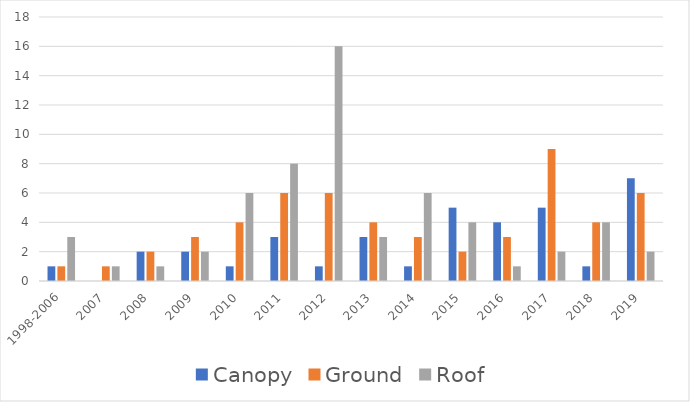
| Category | Canopy | Ground | Roof |
|---|---|---|---|
| 1998-2006 | 1 | 1 | 3 |
| 2007 | 0 | 1 | 1 |
| 2008 | 2 | 2 | 1 |
| 2009 | 2 | 3 | 2 |
| 2010 | 1 | 4 | 6 |
| 2011 | 3 | 6 | 8 |
| 2012 | 1 | 6 | 16 |
| 2013 | 3 | 4 | 3 |
| 2014 | 1 | 3 | 6 |
| 2015 | 5 | 2 | 4 |
| 2016 | 4 | 3 | 1 |
| 2017 | 5 | 9 | 2 |
| 2018 | 1 | 4 | 4 |
| 2019 | 7 | 6 | 2 |